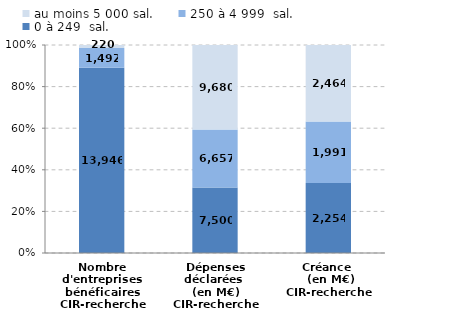
| Category | 0 à 249  sal. | 250 à 4 999  sal. | au moins 5 000 sal. |
|---|---|---|---|
| Nombre d'entreprises bénéficaires
CIR-recherche | 13946 | 1492 | 220 |
| Dépenses déclarées 
(en M€)
CIR-recherche | 7499.94 | 6657.11 | 9679.75 |
| Créance 
 (en M€)
CIR-recherche | 2254.07 | 1991.13 | 2464.28 |